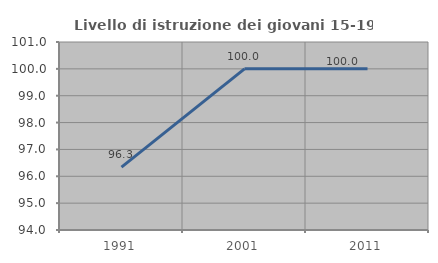
| Category | Livello di istruzione dei giovani 15-19 anni |
|---|---|
| 1991.0 | 96.341 |
| 2001.0 | 100 |
| 2011.0 | 100 |